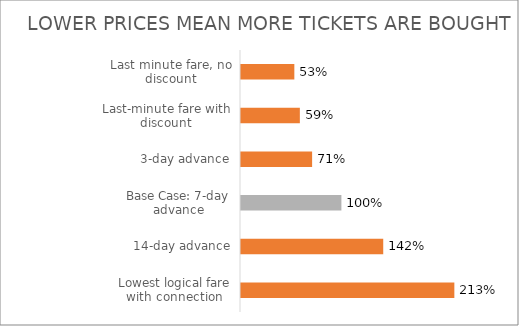
| Category | Tickets as % of Base case |
|---|---|
| Lowest logical fare with connection | 2.125 |
| 14-day advance | 1.417 |
| Base Case: 7-day advance | 1 |
| 3-day advance | 0.708 |
| Last-minute fare with discount | 0.586 |
| Last minute fare, no discount | 0.531 |